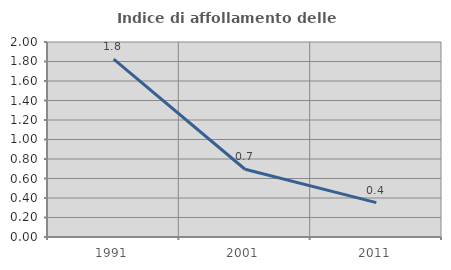
| Category | Indice di affollamento delle abitazioni  |
|---|---|
| 1991.0 | 1.824 |
| 2001.0 | 0.695 |
| 2011.0 | 0.353 |